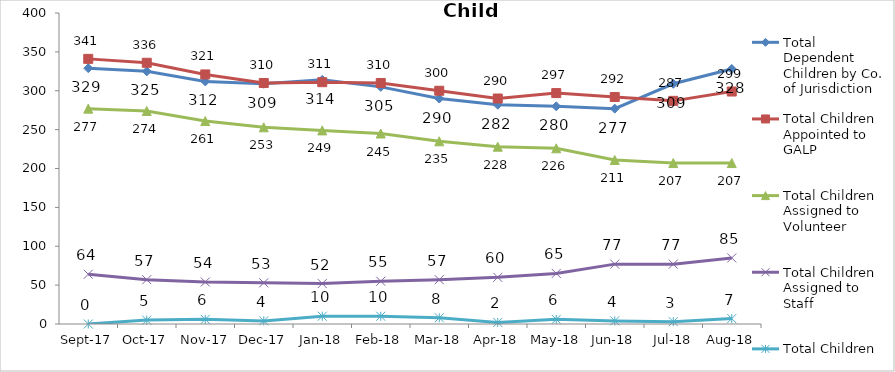
| Category | Total Dependent Children by Co. of Jurisdiction | Total Children Appointed to GALP | Total Children Assigned to Volunteer | Total Children Assigned to Staff | Total Children Unassigned |
|---|---|---|---|---|---|
| 2017-09-01 | 329 | 341 | 277 | 64 | 0 |
| 2017-10-01 | 325 | 336 | 274 | 57 | 5 |
| 2017-11-01 | 312 | 321 | 261 | 54 | 6 |
| 2017-12-01 | 309 | 310 | 253 | 53 | 4 |
| 2018-01-01 | 314 | 311 | 249 | 52 | 10 |
| 2018-02-01 | 305 | 310 | 245 | 55 | 10 |
| 2018-03-01 | 290 | 300 | 235 | 57 | 8 |
| 2018-04-01 | 282 | 290 | 228 | 60 | 2 |
| 2018-05-01 | 280 | 297 | 226 | 65 | 6 |
| 2018-06-01 | 277 | 292 | 211 | 77 | 4 |
| 2018-07-01 | 309 | 287 | 207 | 77 | 3 |
| 2018-08-01 | 328 | 299 | 207 | 85 | 7 |